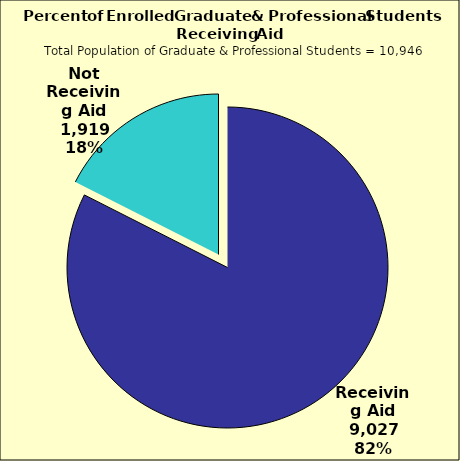
| Category | Series 0 |
|---|---|
| Receiving Aid | 9027 |
| Not Receiving Aid | 1919 |